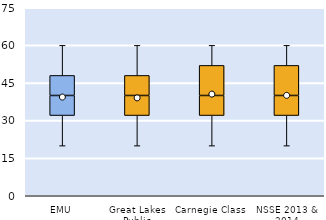
| Category | 25th | 50th | 75th |
|---|---|---|---|
| EMU | 32 | 8 | 8 |
| Great Lakes Public | 32 | 8 | 8 |
| Carnegie Class | 32 | 8 | 12 |
| NSSE 2013 & 2014 | 32 | 8 | 12 |